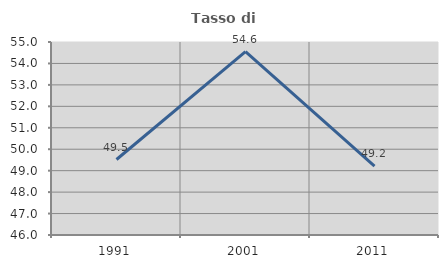
| Category | Tasso di occupazione   |
|---|---|
| 1991.0 | 49.52 |
| 2001.0 | 54.552 |
| 2011.0 | 49.216 |